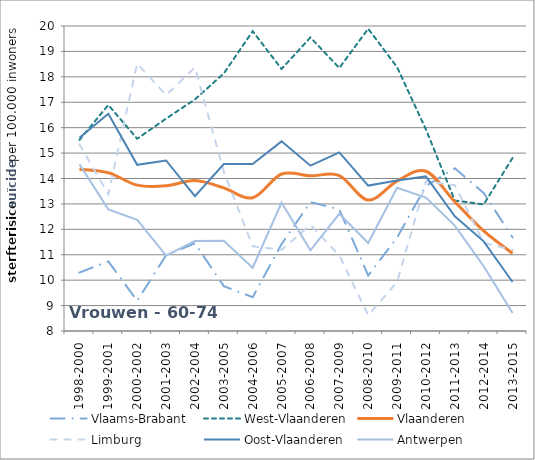
| Category | Vlaams-Brabant | West-Vlaanderen | Vlaanderen | Limburg | Oost-Vlaanderen | Antwerpen |
|---|---|---|---|---|---|---|
| 1998-2000 | 10.298 | 15.515 | 14.365 | 15.342 | 15.606 | 14.557 |
| 1999-2001 | 10.739 | 16.892 | 14.227 | 13.382 | 16.544 | 12.784 |
| 2000-2002 | 9.189 | 15.564 | 13.739 | 18.524 | 14.537 | 12.375 |
| 2001-2003 | 10.978 | 16.355 | 13.714 | 17.28 | 14.709 | 10.969 |
| 2002-2004 | 11.45 | 17.111 | 13.918 | 18.371 | 13.305 | 11.538 |
| 2003-2005 | 9.764 | 18.135 | 13.63 | 14.263 | 14.568 | 11.548 |
| 2004-2006 | 9.331 | 19.796 | 13.244 | 11.334 | 14.567 | 10.488 |
| 2005-2007 | 11.419 | 18.31 | 14.177 | 11.196 | 15.461 | 13.052 |
| 2006-2008 | 13.073 | 19.55 | 14.105 | 12.175 | 14.504 | 11.176 |
| 2007-2009 | 12.783 | 18.346 | 14.117 | 10.97 | 15.024 | 12.611 |
| 2008-2010 | 10.185 | 19.893 | 13.154 | 8.617 | 13.722 | 11.459 |
| 2009-2011 | 11.673 | 18.381 | 13.899 | 9.928 | 13.918 | 13.636 |
| 2010-2012 | 13.703 | 15.929 | 14.285 | 13.888 | 14.081 | 13.252 |
| 2011-2013 | 14.402 | 13.135 | 13.085 | 13.738 | 12.512 | 12.148 |
| 2012-2014 | 13.431 | 12.979 | 11.935 | 11.463 | 11.528 | 10.548 |
| 2013-2015 | 11.683 | 14.809 | 11.054 | 11.193 | 9.929 | 8.705 |